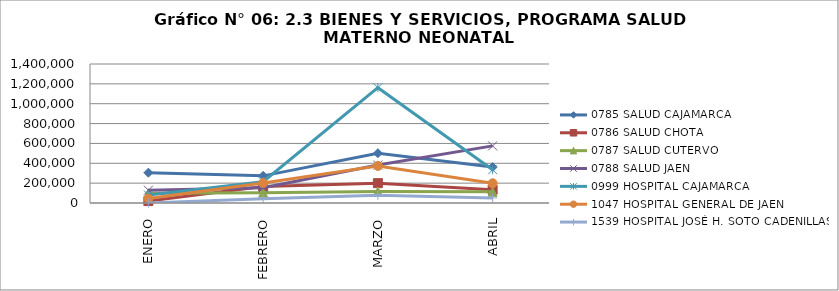
| Category | 0785 SALUD CAJAMARCA | 0786 SALUD CHOTA | 0787 SALUD CUTERVO | 0788 SALUD JAEN | 0999 HOSPITAL CAJAMARCA | 1047 HOSPITAL GENERAL DE JAEN | 1539 HOSPITAL JOSÉ H. SOTO CADENILLAS |
|---|---|---|---|---|---|---|---|
| ENERO | 305661 | 19359 | 98062 | 128989 | 80602 | 44718 | 0 |
| FEBRERO | 273342 | 166668 | 104121 | 153770 | 214117 | 201549 | 43695 |
| MARZO | 501648 | 199754 | 115094 | 382099 | 1161729 | 373120 | 77528 |
| ABRIL | 361640 | 134265 | 112679 | 575416 | 334988 | 198748 | 51580 |